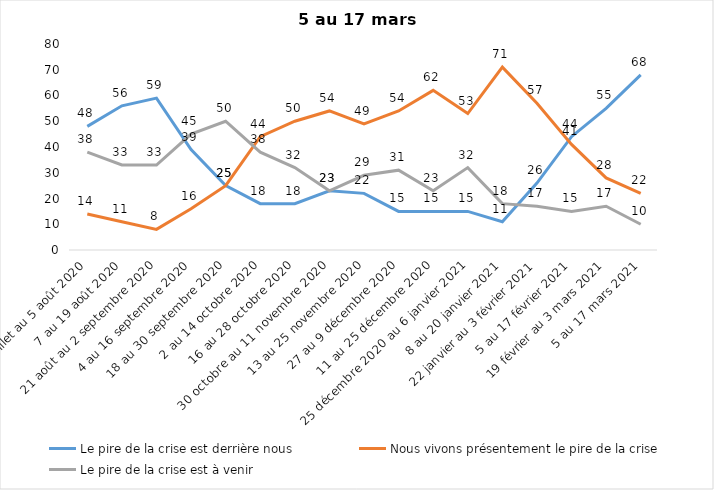
| Category | Le pire de la crise est derrière nous | Nous vivons présentement le pire de la crise | Le pire de la crise est à venir |
|---|---|---|---|
| 24 juillet au 5 août 2020 | 48 | 14 | 38 |
| 7 au 19 août 2020 | 56 | 11 | 33 |
| 21 août au 2 septembre 2020 | 59 | 8 | 33 |
| 4 au 16 septembre 2020 | 39 | 16 | 45 |
| 18 au 30 septembre 2020 | 25 | 25 | 50 |
| 2 au 14 octobre 2020 | 18 | 44 | 38 |
| 16 au 28 octobre 2020 | 18 | 50 | 32 |
| 30 octobre au 11 novembre 2020 | 23 | 54 | 23 |
| 13 au 25 novembre 2020 | 22 | 49 | 29 |
| 27 au 9 décembre 2020 | 15 | 54 | 31 |
| 11 au 25 décembre 2020 | 15 | 62 | 23 |
| 25 décembre 2020 au 6 janvier 2021 | 15 | 53 | 32 |
| 8 au 20 janvier 2021 | 11 | 71 | 18 |
| 22 janvier au 3 février 2021 | 26 | 57 | 17 |
| 5 au 17 février 2021 | 44 | 41 | 15 |
| 19 février au 3 mars 2021 | 55 | 28 | 17 |
| 5 au 17 mars 2021 | 68 | 22 | 10 |